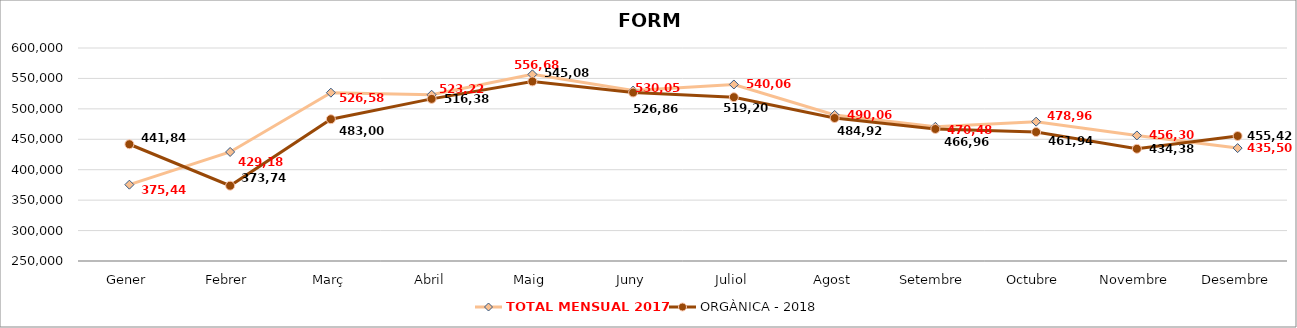
| Category | TOTAL MENSUAL 2017 | ORGÀNICA - 2018 |
|---|---|---|
| Gener | 375440 | 441840 |
| Febrer | 429180 | 373740.01 |
| Març | 526579.5 | 483000 |
| Abril | 523220 | 516380 |
| Maig | 556680 | 545080.01 |
| Juny | 530059.36 | 526860 |
| Juliol | 540060 | 519200 |
| Agost | 490060 | 484920 |
| Setembre | 470480 | 466960 |
| Octubre | 478960 | 461940 |
| Novembre | 456300 | 434380 |
| Desembre | 435505 | 455420.01 |